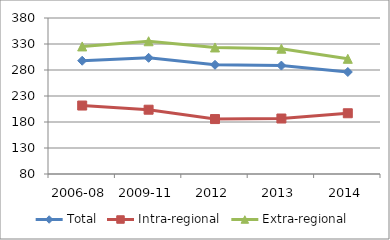
| Category | Total | Intra-regional | Extra-regional |
|---|---|---|---|
| 2006-08 | 297.819 | 211.643 | 325.322 |
| 2009-11 | 303.429 | 203.64 | 335.276 |
| 2012 | 290.031 | 185.638 | 323.348 |
| 2013 | 288.478 | 186.684 | 320.966 |
| 2014 | 276.185 | 196.805 | 301.519 |